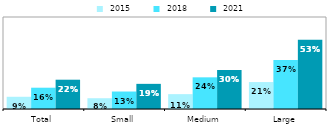
| Category |  2015 |  2018 |  2021 |
|---|---|---|---|
| Total | 0.093 | 0.162 | 0.223 |
| Small | 0.082 | 0.133 | 0.191 |
| Medium | 0.113 | 0.241 | 0.296 |
| Large | 0.205 | 0.373 | 0.526 |